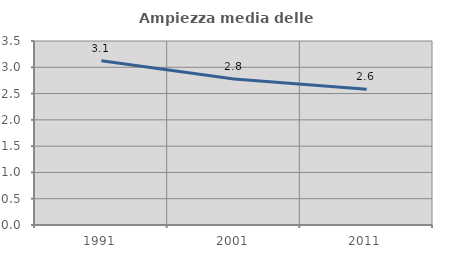
| Category | Ampiezza media delle famiglie |
|---|---|
| 1991.0 | 3.124 |
| 2001.0 | 2.779 |
| 2011.0 | 2.582 |